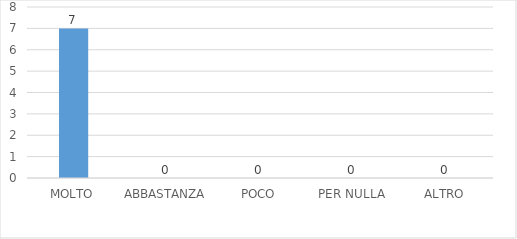
| Category | Series 0 |
|---|---|
| MOLTO | 7 |
| ABBASTANZA | 0 |
| POCO | 0 |
| PER NULLA | 0 |
| ALTRO | 0 |